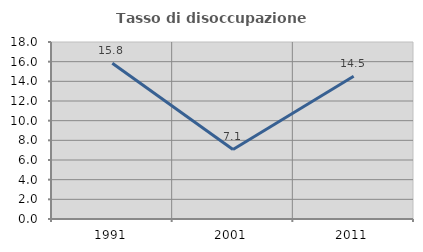
| Category | Tasso di disoccupazione giovanile  |
|---|---|
| 1991.0 | 15.842 |
| 2001.0 | 7.071 |
| 2011.0 | 14.516 |